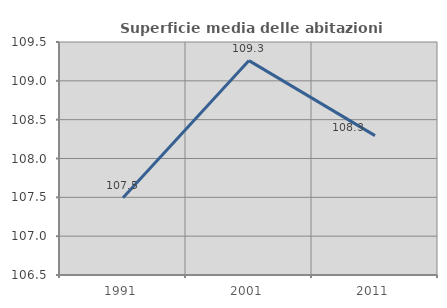
| Category | Superficie media delle abitazioni occupate |
|---|---|
| 1991.0 | 107.495 |
| 2001.0 | 109.26 |
| 2011.0 | 108.295 |